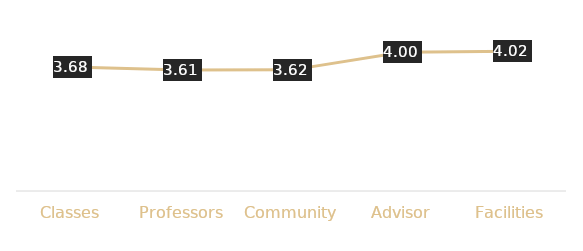
| Category | Total |
|---|---|
|  Classes | 3.679 |
|  Professors | 3.614 |
|  Community | 3.619 |
|  Advisor | 4 |
|  Facilities | 4.024 |